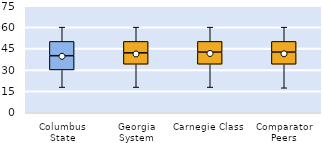
| Category | 25th | 50th | 75th |
|---|---|---|---|
| Columbus State | 30 | 10 | 10 |
| Georgia System | 34 | 8 | 8 |
| Carnegie Class | 34 | 8.5 | 7.5 |
| Comparator Peers | 34 | 8.5 | 7.5 |